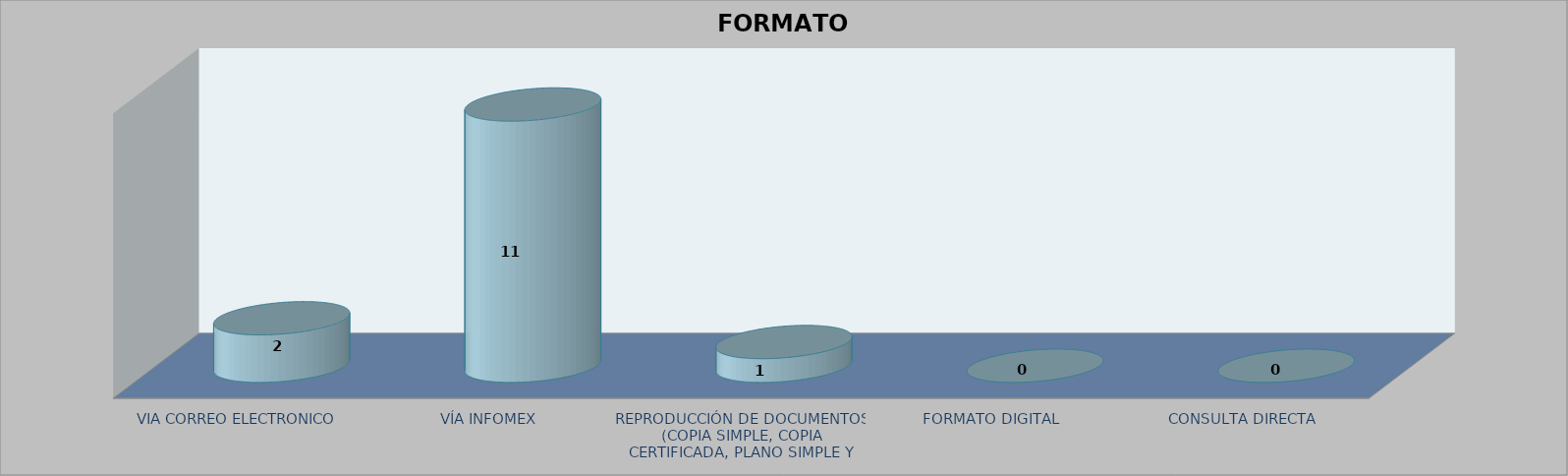
| Category |        FORMATO SOLICITADO | Series 1 | Series 2 |
|---|---|---|---|
| VIA CORREO ELECTRONICO |  |  | 2 |
| VÍA INFOMEX |  |  | 11 |
| REPRODUCCIÓN DE DOCUMENTOS (COPIA SIMPLE, COPIA CERTIFICADA, PLANO SIMPLE Y PLANO CERTIFICADO) |  |  | 1 |
| FORMATO DIGITAL |  |  | 0 |
| CONSULTA DIRECTA |  |  | 0 |